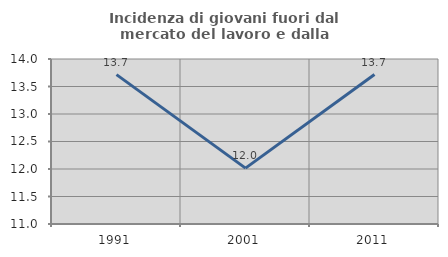
| Category | Incidenza di giovani fuori dal mercato del lavoro e dalla formazione  |
|---|---|
| 1991.0 | 13.716 |
| 2001.0 | 12.016 |
| 2011.0 | 13.717 |